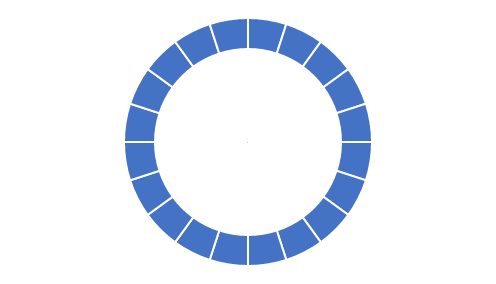
| Category | Series 1 |
|---|---|
| 0 | 0.2 |
| 1 | 0.8 |